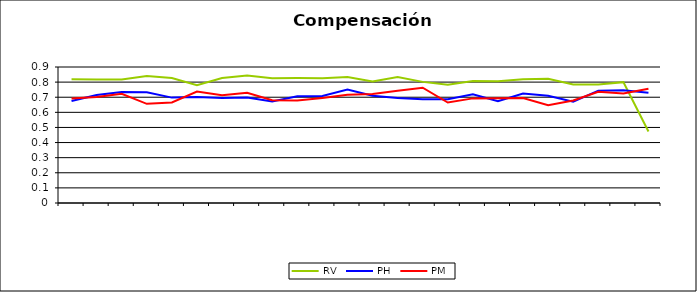
| Category | RV | PH | PM |
|---|---|---|---|
| 0 | 0.819 | 0.675 | 0.691 |
| 1 | 0.818 | 0.714 | 0.701 |
| 2 | 0.817 | 0.734 | 0.722 |
| 3 | 0.84 | 0.732 | 0.656 |
| 4 | 0.827 | 0.697 | 0.666 |
| 5 | 0.78 | 0.701 | 0.737 |
| 6 | 0.827 | 0.695 | 0.713 |
| 7 | 0.844 | 0.699 | 0.73 |
| 8 | 0.826 | 0.672 | 0.68 |
| 9 | 0.827 | 0.706 | 0.678 |
| 10 | 0.826 | 0.709 | 0.696 |
| 11 | 0.834 | 0.751 | 0.717 |
| 12 | 0.804 | 0.709 | 0.721 |
| 13 | 0.834 | 0.694 | 0.743 |
| 14 | 0.802 | 0.687 | 0.763 |
| 15 | 0.783 | 0.687 | 0.665 |
| 16 | 0.807 | 0.72 | 0.692 |
| 17 | 0.805 | 0.674 | 0.693 |
| 18 | 0.82 | 0.724 | 0.695 |
| 19 | 0.822 | 0.71 | 0.646 |
| 20 | 0.784 | 0.67 | 0.678 |
| 21 | 0.785 | 0.743 | 0.736 |
| 22 | 0.8 | 0.745 | 0.725 |
| 23 | 0.473 | 0.729 | 0.756 |